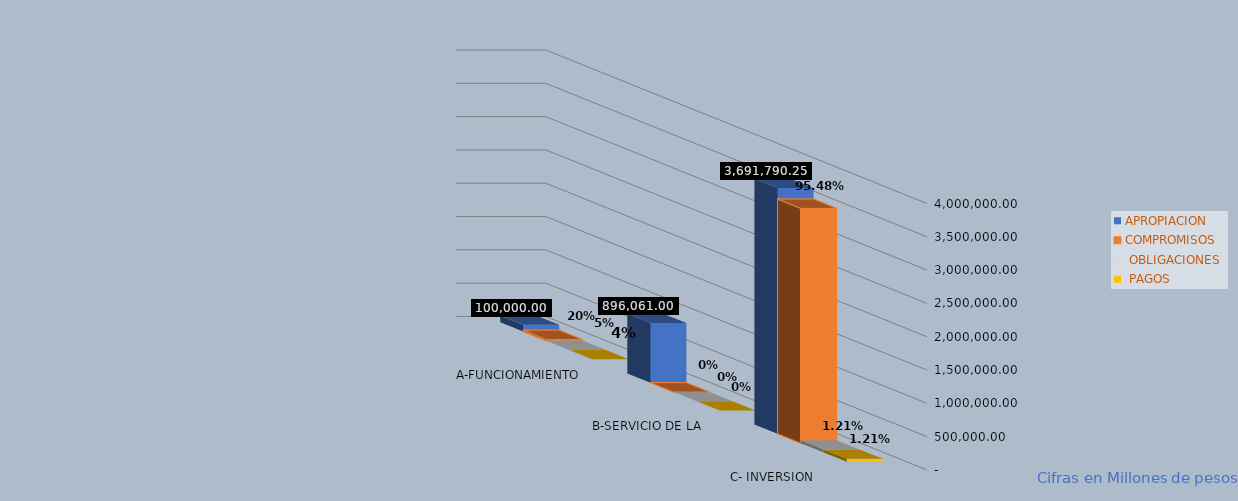
| Category | APROPIACION | COMPROMISOS |  OBLIGACIONES |  PAGOS |
|---|---|---|---|---|
| A-FUNCIONAMIENTO | 100000.001 | 19973.104 | 4664.63 | 3868.919 |
| B-SERVICIO DE LA DEUDA PÚBLICA | 896061 | 0 | 0 | 0 |
| C- INVERSION | 3691790.247 | 3524897.585 | 44756.554 | 44756.554 |